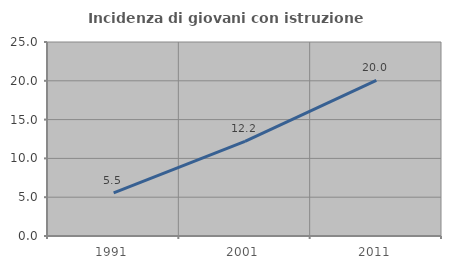
| Category | Incidenza di giovani con istruzione universitaria |
|---|---|
| 1991.0 | 5.547 |
| 2001.0 | 12.184 |
| 2011.0 | 20.047 |